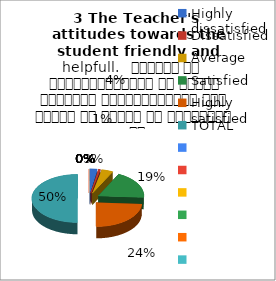
| Category | 3 The Teacher's  attitudes towards the student friendly and helpfull.   शिक्षक का विद्यार्थियों के प्रति व्यवहार मित्रतापूर्ण एवम सहयोग के भावना से परिपूर्ण था |
|---|---|
| Highly dissatisfied | 4 |
| Dissatisfied | 1 |
| Average | 6 |
| Satisfied | 28 |
| Highly satisfied | 36 |
| TOTAL | 75 |